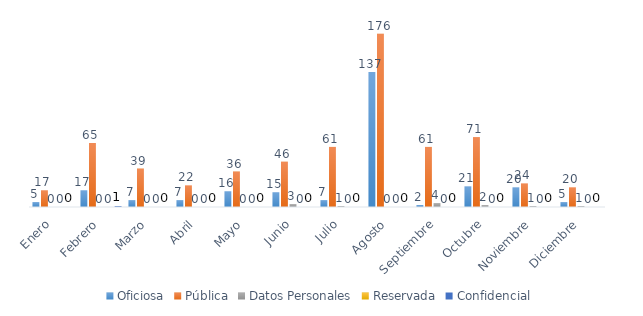
| Category | Oficiosa | Pública | Datos Personales | Reservada | Confidencial |
|---|---|---|---|---|---|
| Enero | 5 | 17 | 0 | 0 | 0 |
| Febrero | 17 | 65 | 0 | 0 | 1 |
| Marzo | 7 | 39 | 0 | 0 | 0 |
| Abril | 7 | 22 | 0 | 0 | 0 |
| Mayo | 16 | 36 | 0 | 0 | 0 |
| Junio | 15 | 46 | 3 | 0 | 0 |
| Julio | 7 | 61 | 1 | 0 | 0 |
| Agosto | 137 | 176 | 0 | 0 | 0 |
| Septiembre | 2 | 61 | 4 | 0 | 0 |
| Octubre | 21 | 71 | 2 | 0 | 0 |
| Noviembre | 20 | 24 | 1 | 0 | 0 |
| Diciembre | 5 | 20 | 1 | 0 | 0 |